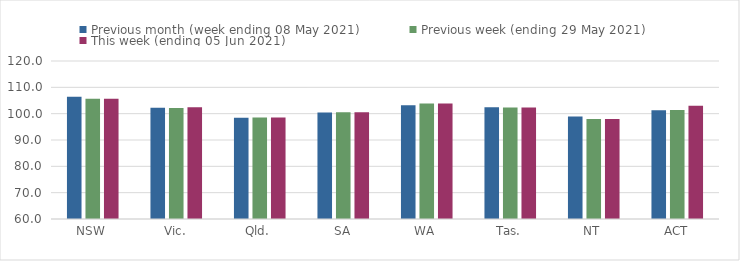
| Category | Previous month (week ending 08 May 2021) | Previous week (ending 29 May 2021) | This week (ending 05 Jun 2021) |
|---|---|---|---|
| NSW | 106.38 | 105.68 | 105.68 |
| Vic. | 102.27 | 102.14 | 102.47 |
| Qld. | 98.49 | 98.5 | 98.5 |
| SA | 100.49 | 100.52 | 100.52 |
| WA | 103.24 | 103.87 | 103.87 |
| Tas. | 102.48 | 102.34 | 102.34 |
| NT | 98.9 | 97.99 | 97.99 |
| ACT | 101.28 | 101.39 | 102.97 |